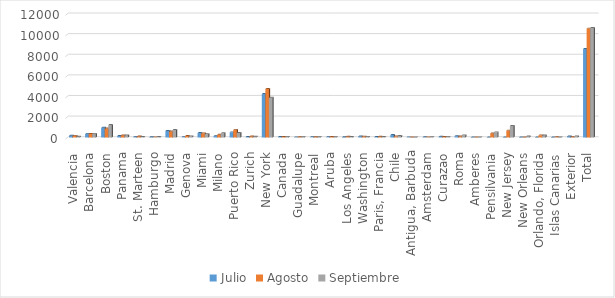
| Category | Julio | Agosto | Septiembre |
|---|---|---|---|
| Valencia | 170 | 159 | 76 |
| Barcelona | 349 | 347 | 352 |
| Boston | 941 | 873 | 1208 |
| Panama | 145 | 202 | 200 |
| St. Marteen | 62 | 98 | 50 |
| Hamburgo | 30 | 12 | 42 |
| Madrid | 636 | 579 | 726 |
| Genova | 35 | 138 | 106 |
| Miami | 429 | 402 | 327 |
| Milano | 156 | 263 | 406 |
| Puerto Rico | 500 | 737 | 441 |
| Zurich | 52 | 90 | 77 |
| New York | 4214 | 4701 | 3858 |
| Canada | 41 | 49 | 57 |
| Guadalupe | 13 | 24 | 22 |
| Montreal | 33 | 32 | 28 |
| Aruba | 34 | 52 | 26 |
| Los Angeles | 32 | 68 | 56 |
| Washington | 100 | 88 | 60 |
| Paris, Francia | 43 | 68 | 47 |
| Chile | 235 | 107 | 145 |
| Antigua, Barbuda | 10 | 5 | 6 |
| Amsterdam | 16 | 13 | 21 |
| Curazao | 68 | 49 | 64 |
| Roma | 133 | 97 | 207 |
| Amberes | 0 | 0 | 0 |
| Pensilvania | 0 | 390 | 499 |
| New Jersey | 0 | 665 | 1119 |
| New Orleans | 0 | 3 | 91 |
| Orlando, Florida | 0 | 205 | 202 |
| Islas Canarias | 4 | 21 | 0 |
| Exterior | 103 | 29 | 106 |
| Total | 8584 | 10566 | 10625 |